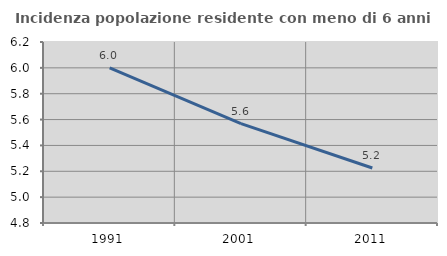
| Category | Incidenza popolazione residente con meno di 6 anni |
|---|---|
| 1991.0 | 6 |
| 2001.0 | 5.569 |
| 2011.0 | 5.226 |